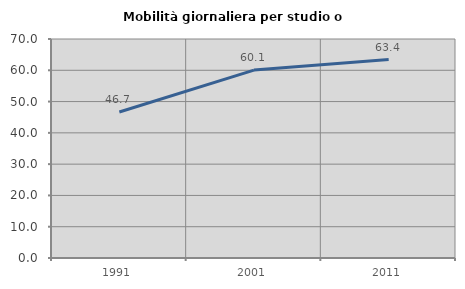
| Category | Mobilità giornaliera per studio o lavoro |
|---|---|
| 1991.0 | 46.677 |
| 2001.0 | 60.071 |
| 2011.0 | 63.439 |